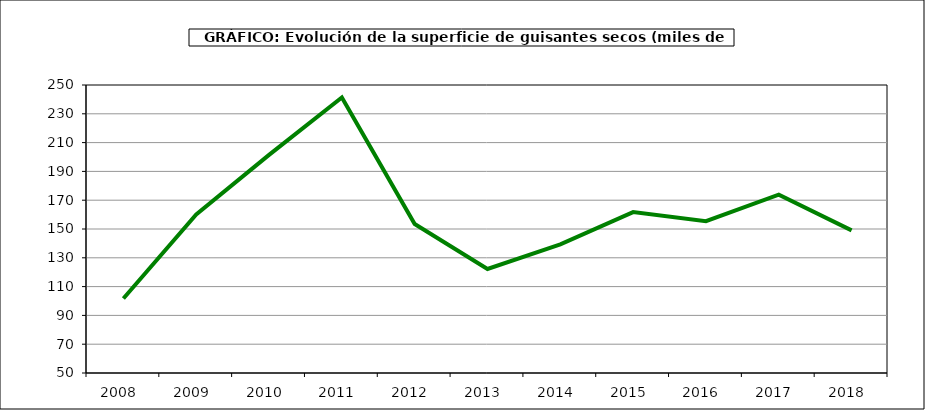
| Category | Superficie |
|---|---|
| 2008.0 | 101.745 |
| 2009.0 | 160.173 |
| 2010.0 | 201.458 |
| 2011.0 | 241.347 |
| 2012.0 | 153.482 |
| 2013.0 | 122.246 |
| 2014.0 | 139.386 |
| 2015.0 | 161.746 |
| 2016.0 | 155.409 |
| 2017.0 | 173.854 |
| 2018.0 | 149.02 |